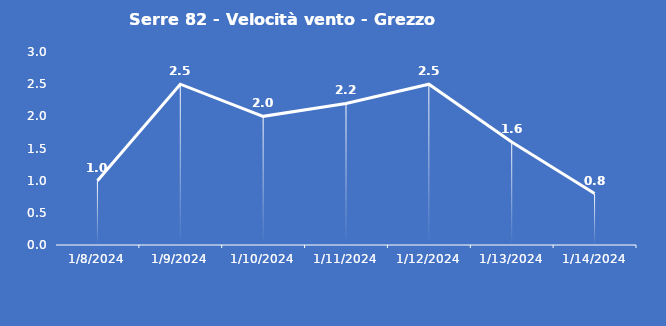
| Category | Serre 82 - Velocità vento - Grezzo (m/s) |
|---|---|
| 1/8/24 | 1 |
| 1/9/24 | 2.5 |
| 1/10/24 | 2 |
| 1/11/24 | 2.2 |
| 1/12/24 | 2.5 |
| 1/13/24 | 1.6 |
| 1/14/24 | 0.8 |